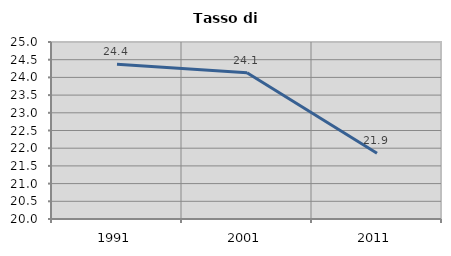
| Category | Tasso di disoccupazione   |
|---|---|
| 1991.0 | 24.372 |
| 2001.0 | 24.134 |
| 2011.0 | 21.86 |